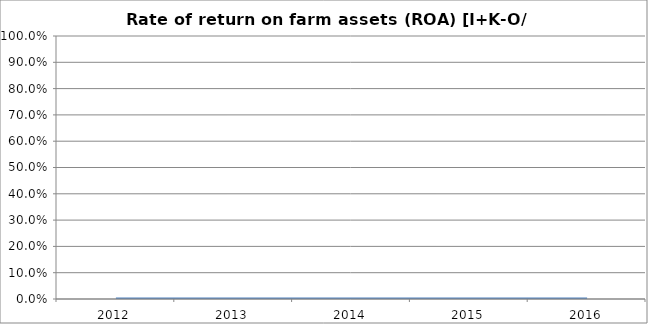
| Category | Rate of return on farm assets (ROA) [I+K-O)/ avg C] |
|---|---|
| 2012.0 | 0 |
| 2013.0 | 0 |
| 2014.0 | 0 |
| 2015.0 | 0 |
| 2016.0 | 0 |